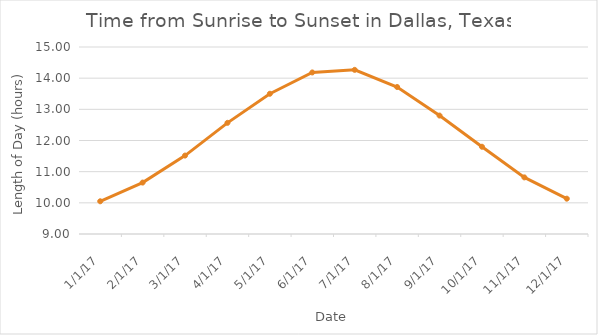
| Category | Length of Day (hours) |
|---|---|
| 1/1/17 | 10.05 |
| 2/1/17 | 10.65 |
| 3/1/17 | 11.517 |
| 4/1/17 | 12.567 |
| 5/1/17 | 13.5 |
| 6/1/17 | 14.183 |
| 7/1/17 | 14.267 |
| 8/1/17 | 13.717 |
| 9/1/17 | 12.8 |
| 10/1/17 | 11.8 |
| 11/1/17 | 10.817 |
| 12/1/17 | 10.133 |